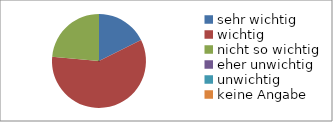
| Category | Series 0 |
|---|---|
| sehr wichtig | 3 |
| wichtig | 10 |
| nicht so wichtig | 4 |
| eher unwichtig | 0 |
| unwichtig | 0 |
| keine Angabe | 0 |